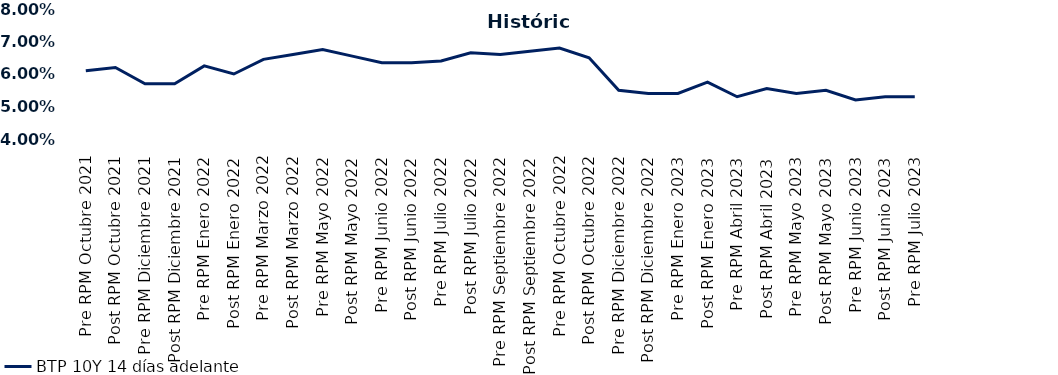
| Category | BTP 10Y 14 días adelante |
|---|---|
| Pre RPM Octubre 2021 | 0.061 |
| Post RPM Octubre 2021 | 0.062 |
| Pre RPM Diciembre 2021 | 0.057 |
| Post RPM Diciembre 2021 | 0.057 |
| Pre RPM Enero 2022 | 0.062 |
| Post RPM Enero 2022 | 0.06 |
| Pre RPM Marzo 2022 | 0.064 |
| Post RPM Marzo 2022 | 0.066 |
| Pre RPM Mayo 2022 | 0.068 |
| Post RPM Mayo 2022 | 0.066 |
| Pre RPM Junio 2022 | 0.064 |
| Post RPM Junio 2022 | 0.064 |
| Pre RPM Julio 2022 | 0.064 |
| Post RPM Julio 2022 | 0.066 |
| Pre RPM Septiembre 2022 | 0.066 |
| Post RPM Septiembre 2022 | 0.067 |
| Pre RPM Octubre 2022 | 0.068 |
| Post RPM Octubre 2022 | 0.065 |
| Pre RPM Diciembre 2022 | 0.055 |
| Post RPM Diciembre 2022 | 0.054 |
| Pre RPM Enero 2023 | 0.054 |
| Post RPM Enero 2023 | 0.058 |
| Pre RPM Abril 2023 | 0.053 |
| Post RPM Abril 2023 | 0.056 |
| Pre RPM Mayo 2023 | 0.054 |
| Post RPM Mayo 2023 | 0.055 |
| Pre RPM Junio 2023 | 0.052 |
| Post RPM Junio 2023 | 0.053 |
| Pre RPM Julio 2023 | 0.053 |